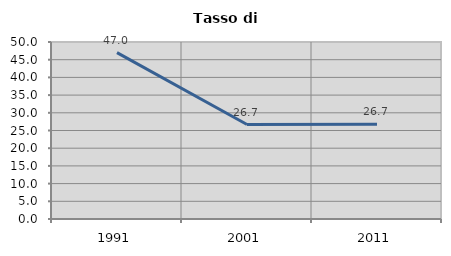
| Category | Tasso di disoccupazione   |
|---|---|
| 1991.0 | 46.981 |
| 2001.0 | 26.683 |
| 2011.0 | 26.738 |